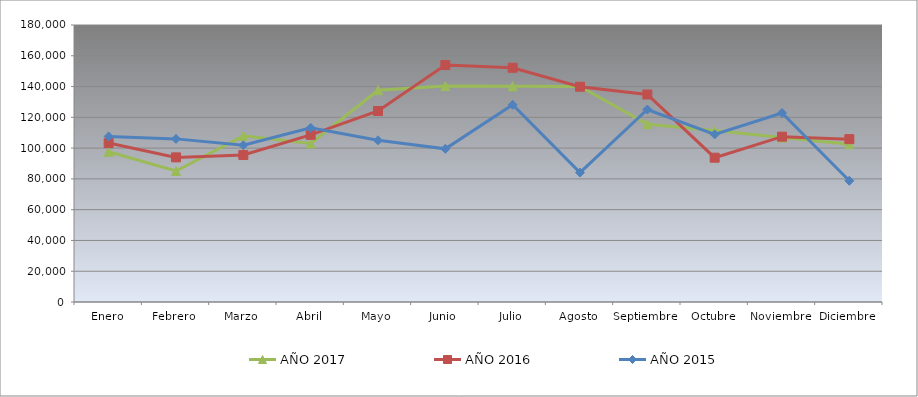
| Category | AÑO 2017 | AÑO 2016 | AÑO 2015 |
|---|---|---|---|
| Enero | 97670 | 103275 | 107580 |
| Febrero | 85125 | 93970 | 106000 |
| Marzo | 107985 | 95540 | 101850 |
| Abril | 103030 | 108610 | 113140 |
| Mayo | 137590 | 124110 | 105070 |
| Junio | 140285 | 153980 | 99530 |
| Julio | 140175 | 152210 | 128150 |
| Agosto | 140060 | 139890 | 84080 |
| Septiembre | 115465 | 134840 | 125090 |
| Octubre | 111390 | 93770 | 108925 |
| Noviembre | 106890 | 107430 | 122820 |
| Diciembre | 102540 | 105830 | 78770 |